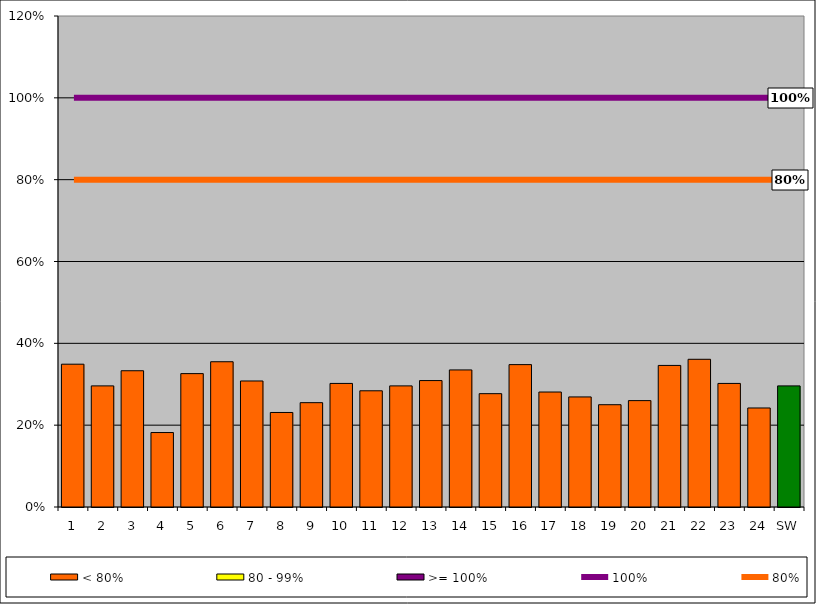
| Category | < 80% | 80 - 99% | >= 100% |
|---|---|---|---|
| 1 | 0.349 | 0 | 0 |
| 2 | 0.296 | 0 | 0 |
| 3 | 0.333 | 0 | 0 |
| 4 | 0.182 | 0 | 0 |
| 5 | 0.326 | 0 | 0 |
| 6 | 0.355 | 0 | 0 |
| 7 | 0.308 | 0 | 0 |
| 8 | 0.231 | 0 | 0 |
| 9 | 0.255 | 0 | 0 |
| 10 | 0.302 | 0 | 0 |
| 11 | 0.284 | 0 | 0 |
| 12 | 0.296 | 0 | 0 |
| 13 | 0.309 | 0 | 0 |
| 14 | 0.335 | 0 | 0 |
| 15 | 0.277 | 0 | 0 |
| 16 | 0.348 | 0 | 0 |
| 17 | 0.281 | 0 | 0 |
| 18 | 0.269 | 0 | 0 |
| 19 | 0.25 | 0 | 0 |
| 20 | 0.26 | 0 | 0 |
| 21 | 0.346 | 0 | 0 |
| 22 | 0.361 | 0 | 0 |
| 23 | 0.302 | 0 | 0 |
| 24 | 0.242 | 0 | 0 |
| SW | 0.296 | 0 | 0 |